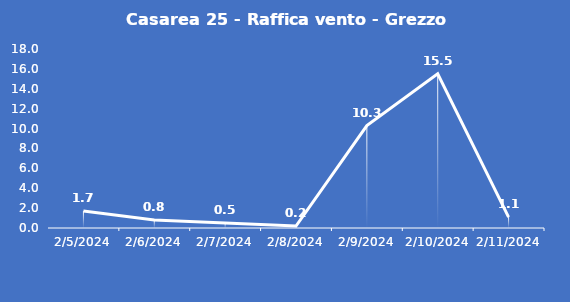
| Category | Casarea 25 - Raffica vento - Grezzo (m/s) |
|---|---|
| 2/5/24 | 1.7 |
| 2/6/24 | 0.8 |
| 2/7/24 | 0.5 |
| 2/8/24 | 0.2 |
| 2/9/24 | 10.3 |
| 2/10/24 | 15.5 |
| 2/11/24 | 1.1 |